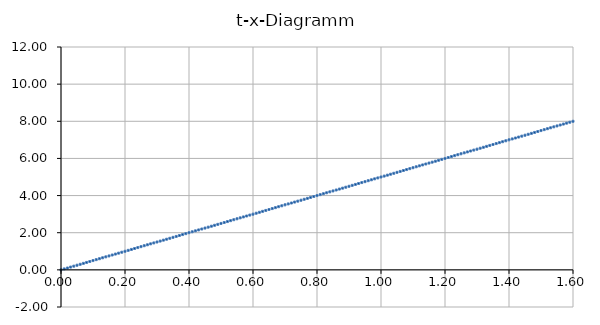
| Category | Series 0 |
|---|---|
| 0.0 | 0 |
| 0.01 | 0.05 |
| 0.02 | 0.1 |
| 0.03 | 0.15 |
| 0.04 | 0.2 |
| 0.05 | 0.25 |
| 0.06 | 0.3 |
| 0.07 | 0.35 |
| 0.08 | 0.4 |
| 0.09 | 0.45 |
| 0.1 | 0.5 |
| 0.11 | 0.55 |
| 0.12 | 0.6 |
| 0.13 | 0.65 |
| 0.14 | 0.7 |
| 0.15 | 0.75 |
| 0.16 | 0.8 |
| 0.17 | 0.85 |
| 0.18 | 0.9 |
| 0.19 | 0.95 |
| 0.2 | 1 |
| 0.21 | 1.05 |
| 0.22 | 1.1 |
| 0.23 | 1.15 |
| 0.24 | 1.2 |
| 0.25 | 1.25 |
| 0.26 | 1.3 |
| 0.27 | 1.35 |
| 0.28 | 1.4 |
| 0.29 | 1.45 |
| 0.3 | 1.5 |
| 0.31 | 1.55 |
| 0.32 | 1.6 |
| 0.33 | 1.65 |
| 0.34 | 1.7 |
| 0.35 | 1.75 |
| 0.36 | 1.8 |
| 0.37 | 1.85 |
| 0.38 | 1.9 |
| 0.39 | 1.95 |
| 0.4 | 2 |
| 0.41 | 2.05 |
| 0.42 | 2.1 |
| 0.43 | 2.15 |
| 0.44 | 2.2 |
| 0.45 | 2.25 |
| 0.46 | 2.3 |
| 0.47 | 2.35 |
| 0.48 | 2.4 |
| 0.49 | 2.45 |
| 0.5 | 2.5 |
| 0.51 | 2.55 |
| 0.52 | 2.6 |
| 0.53 | 2.65 |
| 0.54 | 2.7 |
| 0.55 | 2.75 |
| 0.56 | 2.8 |
| 0.57 | 2.85 |
| 0.58 | 2.9 |
| 0.59 | 2.95 |
| 0.6 | 3 |
| 0.61 | 3.05 |
| 0.62 | 3.1 |
| 0.63 | 3.15 |
| 0.64 | 3.2 |
| 0.65 | 3.25 |
| 0.66 | 3.3 |
| 0.67 | 3.35 |
| 0.68 | 3.4 |
| 0.69 | 3.45 |
| 0.7 | 3.5 |
| 0.71 | 3.55 |
| 0.72 | 3.6 |
| 0.73 | 3.65 |
| 0.74 | 3.7 |
| 0.75 | 3.75 |
| 0.76 | 3.8 |
| 0.77 | 3.85 |
| 0.78 | 3.9 |
| 0.790000000000001 | 3.95 |
| 0.8 | 4 |
| 0.810000000000001 | 4.05 |
| 0.82 | 4.1 |
| 0.83 | 4.15 |
| 0.84 | 4.2 |
| 0.850000000000001 | 4.25 |
| 0.860000000000001 | 4.3 |
| 0.87 | 4.35 |
| 0.88 | 4.4 |
| 0.890000000000001 | 4.45 |
| 0.900000000000001 | 4.5 |
| 0.910000000000001 | 4.55 |
| 0.92 | 4.6 |
| 0.930000000000001 | 4.65 |
| 0.940000000000001 | 4.7 |
| 0.950000000000001 | 4.75 |
| 0.960000000000001 | 4.8 |
| 0.970000000000001 | 4.85 |
| 0.980000000000001 | 4.9 |
| 0.990000000000001 | 4.95 |
| 1.0 | 5 |
| 1.01 | 5.05 |
| 1.02 | 5.1 |
| 1.03 | 5.15 |
| 1.04 | 5.2 |
| 1.05 | 5.25 |
| 1.06 | 5.3 |
| 1.07 | 5.35 |
| 1.08 | 5.4 |
| 1.09 | 5.45 |
| 1.1 | 5.5 |
| 1.11 | 5.55 |
| 1.12 | 5.6 |
| 1.13 | 5.65 |
| 1.14 | 5.7 |
| 1.15 | 5.75 |
| 1.16 | 5.8 |
| 1.17 | 5.85 |
| 1.18 | 5.9 |
| 1.19 | 5.95 |
| 1.2 | 6 |
| 1.21 | 6.05 |
| 1.22 | 6.1 |
| 1.23 | 6.15 |
| 1.24 | 6.2 |
| 1.25 | 6.25 |
| 1.26 | 6.3 |
| 1.27 | 6.35 |
| 1.28 | 6.4 |
| 1.29 | 6.45 |
| 1.3 | 6.5 |
| 1.31 | 6.55 |
| 1.32 | 6.6 |
| 1.33 | 6.65 |
| 1.34 | 6.7 |
| 1.35 | 6.75 |
| 1.36 | 6.8 |
| 1.37 | 6.85 |
| 1.38 | 6.9 |
| 1.39 | 6.95 |
| 1.4 | 7 |
| 1.41 | 7.05 |
| 1.42 | 7.1 |
| 1.43 | 7.15 |
| 1.44 | 7.2 |
| 1.45 | 7.25 |
| 1.46 | 7.3 |
| 1.47 | 7.35 |
| 1.48 | 7.4 |
| 1.49 | 7.45 |
| 1.5 | 7.5 |
| 1.51 | 7.55 |
| 1.52 | 7.6 |
| 1.53 | 7.65 |
| 1.54 | 7.7 |
| 1.55 | 7.75 |
| 1.56 | 7.8 |
| 1.57 | 7.85 |
| 1.58 | 7.9 |
| 1.59 | 7.95 |
| 1.6 | 8 |